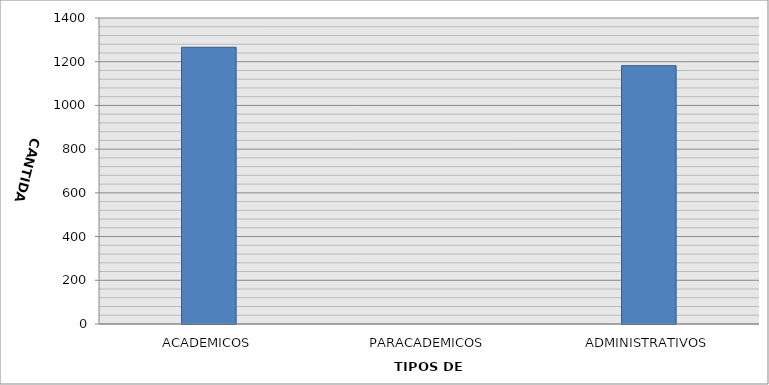
| Category | CANTIDAD |
|---|---|
| ACADEMICOS | 1266 |
| PARACADEMICOS | 0 |
| ADMINISTRATIVOS | 1182 |